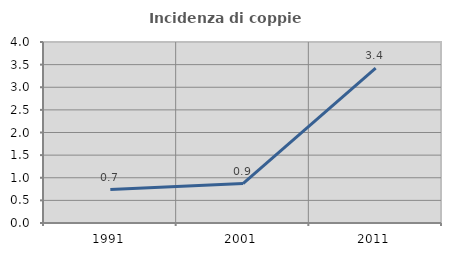
| Category | Incidenza di coppie miste |
|---|---|
| 1991.0 | 0.739 |
| 2001.0 | 0.872 |
| 2011.0 | 3.422 |